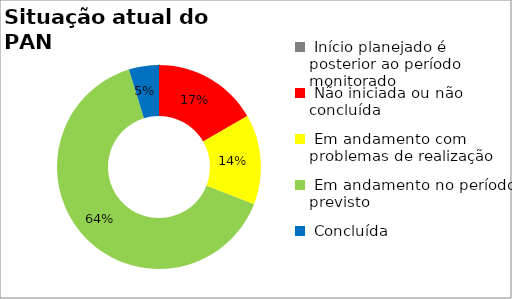
| Category | Series 0 |
|---|---|
|  Início planejado é posterior ao período monitorado | 0 |
|  Não iniciada ou não concluída | 0.167 |
|  Em andamento com problemas de realização | 0.143 |
|  Em andamento no período previsto  | 0.643 |
|  Concluída | 0.048 |